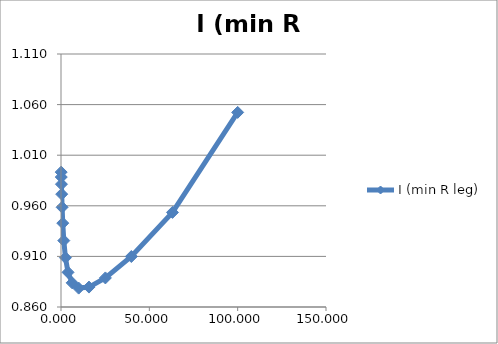
| Category | I (min R leg) |
|---|---|
| 0.1 | 0.993 |
| 0.158489319246111 | 0.988 |
| 0.251188643150958 | 0.981 |
| 0.398107170553497 | 0.971 |
| 0.630957344480193 | 0.959 |
| 1.0 | 0.943 |
| 1.584893192461114 | 0.926 |
| 2.511886431509581 | 0.909 |
| 3.981071705534972 | 0.894 |
| 6.309573444801934 | 0.884 |
| 10.0 | 0.879 |
| 15.84893192461114 | 0.88 |
| 25.1188643150958 | 0.889 |
| 39.81071705534976 | 0.91 |
| 63.09573444801936 | 0.953 |
| 100.0 | 1.052 |